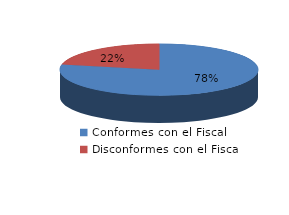
| Category | Series 0 |
|---|---|
| 0 | 1168 |
| 1 | 324 |